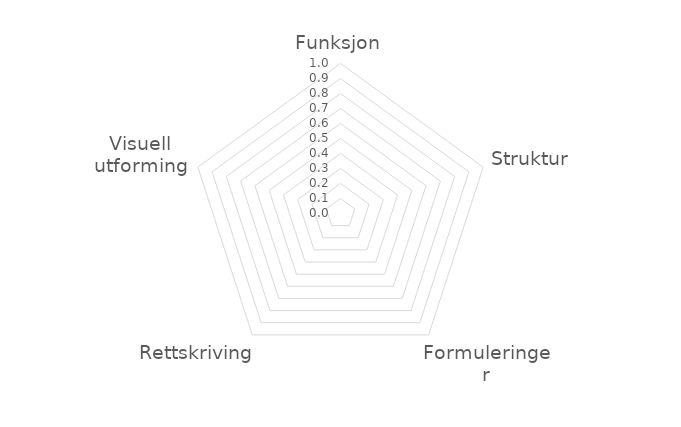
| Category | Series 0 |
|---|---|
| Funksjon | 0 |
| Struktur | 0 |
| Formuleringer | 0 |
| Rettskriving | 0 |
| Visuell utforming | 0 |